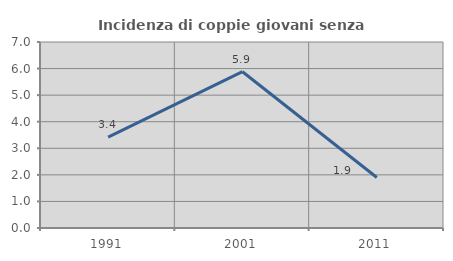
| Category | Incidenza di coppie giovani senza figli |
|---|---|
| 1991.0 | 3.419 |
| 2001.0 | 5.882 |
| 2011.0 | 1.901 |